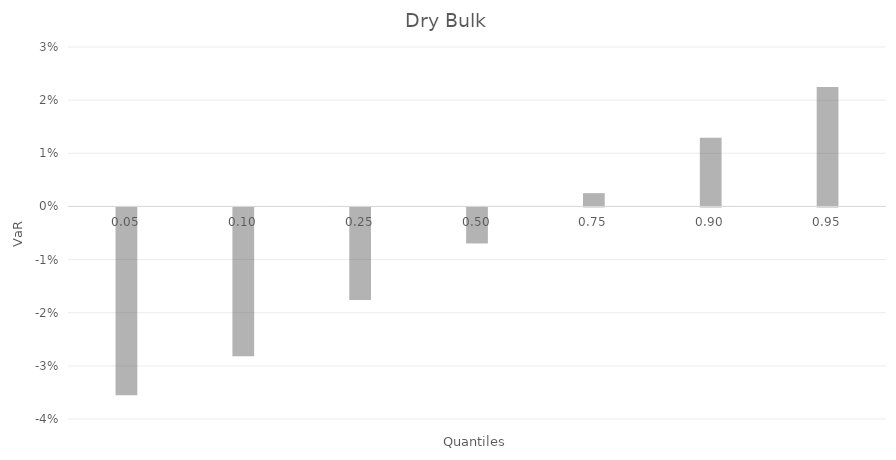
| Category | Series 0 |
|---|---|
| 0.05 | -0.035 |
| 0.1 | -0.028 |
| 0.25 | -0.017 |
| 0.5 | -0.007 |
| 0.75 | 0.002 |
| 0.9 | 0.013 |
| 0.95 | 0.022 |